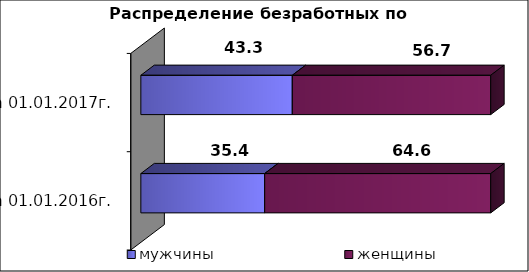
| Category | мужчины  | женщины  |
|---|---|---|
| на 01.01.2016г. | 35.4 | 64.6 |
| на 01.01.2017г. | 43.3 | 56.7 |